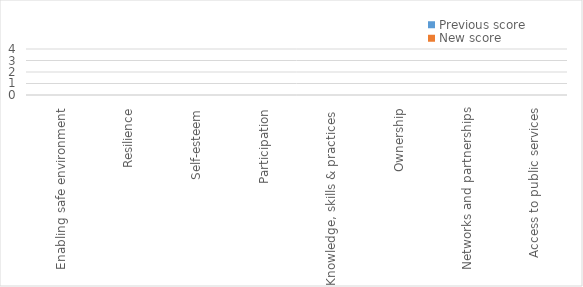
| Category | Previous score | New score |
|---|---|---|
| Enabling safe environment | 0 | 0 |
| Resilience | 0 | 0 |
| Self-esteem | 0 | 0 |
| Participation | 0 | 0 |
| Knowledge, skills & practices  | 0 | 0 |
| Ownership | 0 | 0 |
| Networks and partnerships | 0 | 0 |
| Access to public services | 0 | 0 |